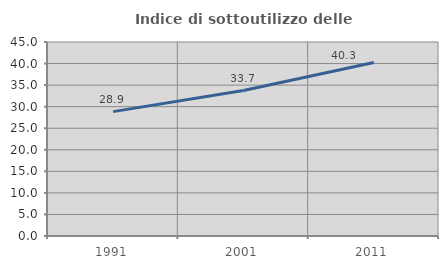
| Category | Indice di sottoutilizzo delle abitazioni  |
|---|---|
| 1991.0 | 28.85 |
| 2001.0 | 33.737 |
| 2011.0 | 40.251 |